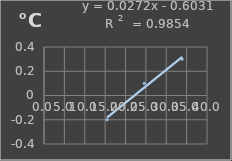
| Category | Temperatura |
|---|---|
| 15.5 | -0.2 |
| 24.6 | 0.1 |
| 33.9 | 0.3 |